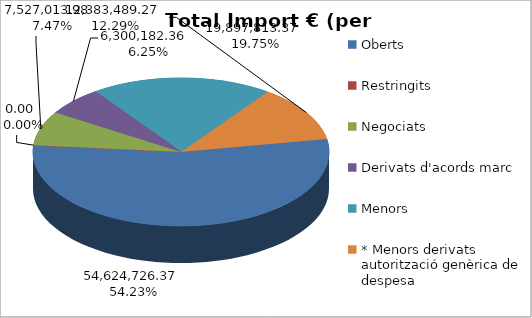
| Category | TOTALS Total Import (€) | TOTALS % total import | TOTALS Nombre Total Contractes | TOTALS % total contractes |
|---|---|---|---|---|
| Oberts | 54624726.37 | 0.542 | 106 | 0.059 |
| Restringits | 0 | 0 | 0 | 0 |
| Negociats | 7527013.98 | 0.075 | 15 | 0.008 |
| Derivats d'acords marc | 6300182.36 | 0.063 | 158 | 0.088 |
| Menors  | 19897813.37 | 0.198 | 1510 | 0.844 |
| * Menors derivats autorització genèrica de despesa | 12383489.27 | 0.123 | 0 | 0 |